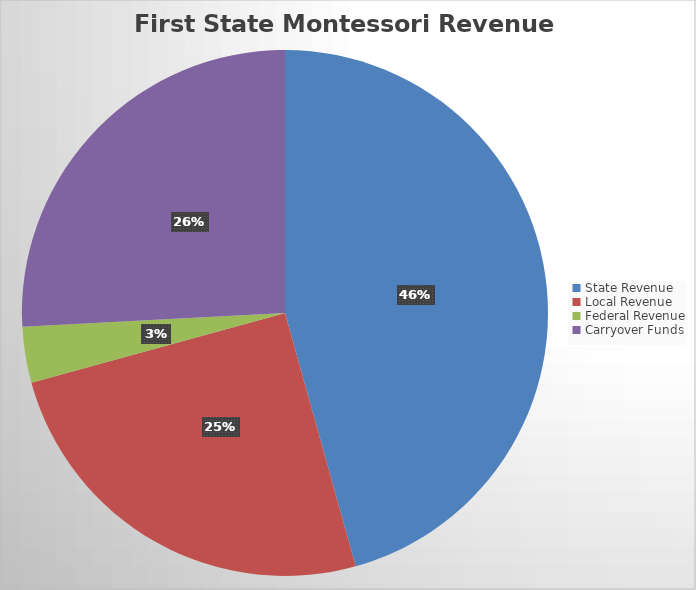
| Category | Series 0 |
|---|---|
| State Revenue | 5249549.29 |
| Local Revenue | 2879820.11 |
| Federal Revenue | 396195 |
| Carryover Funds | 2969055.99 |